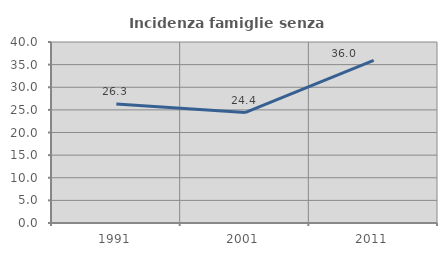
| Category | Incidenza famiglie senza nuclei |
|---|---|
| 1991.0 | 26.287 |
| 2001.0 | 24.406 |
| 2011.0 | 35.957 |